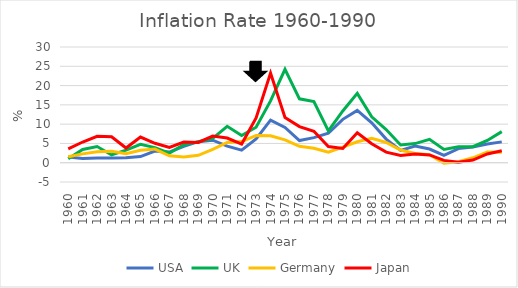
| Category | USA | UK | Germany | Japan |
|---|---|---|---|---|
| 1960.0 | 1.46 | 1 | 1.54 | 3.57 |
| 1961.0 | 1.07 | 3.45 | 2.29 | 5.37 |
| 1962.0 | 1.2 | 4.2 | 2.84 | 6.84 |
| 1963.0 | 1.24 | 2.02 | 2.97 | 6.71 |
| 1964.0 | 1.28 | 3.28 | 2.34 | 3.8 |
| 1965.0 | 1.59 | 4.77 | 3.24 | 6.66 |
| 1966.0 | 3.02 | 3.91 | 3.53 | 5.04 |
| 1967.0 | 2.77 | 2.48 | 1.8 | 3.99 |
| 1968.0 | 4.27 | 4.7 | 1.47 | 5.34 |
| 1969.0 | 5.46 | 5.45 | 1.91 | 5.25 |
| 1970.0 | 5.84 | 6.3 | 3.45 | 6.92 |
| 1971.0 | 4.29 | 9.44 | 5.24 | 6.4 |
| 1972.0 | 3.27 | 7.07 | 5.48 | 4.84 |
| 1973.0 | 6.18 | 9.2 | 7.03 | 11.61 |
| 1974.0 | 11.05 | 16.04 | 6.99 | 23.22 |
| 1975.0 | 9.14 | 24.21 | 5.91 | 11.73 |
| 1976.0 | 5.74 | 16.56 | 4.25 | 9.37 |
| 1977.0 | 6.5 | 15.84 | 3.73 | 8.16 |
| 1978.0 | 7.63 | 8.26 | 2.72 | 4.21 |
| 1979.0 | 11.25 | 13.42 | 4.04 | 3.7 |
| 1980.0 | 13.55 | 17.97 | 5.44 | 7.78 |
| 1981.0 | 10.33 | 11.88 | 6.34 | 4.91 |
| 1982.0 | 6.13 | 8.6 | 5.24 | 2.74 |
| 1983.0 | 3.21 | 4.61 | 3.29 | 1.9 |
| 1984.0 | 4.3 | 4.96 | 2.41 | 2.26 |
| 1985.0 | 3.55 | 6.07 | 2.07 | 2.03 |
| 1986.0 | 1.9 | 3.43 | -0.13 | 0.6 |
| 1987.0 | 3.66 | 4.15 | 0.25 | 0.13 |
| 1988.0 | 4.08 | 4.16 | 1.27 | 0.68 |
| 1989.0 | 4.83 | 5.76 | 2.78 | 2.27 |
| 1990.0 | 5.4 | 8.06 | 2.7 | 3.08 |